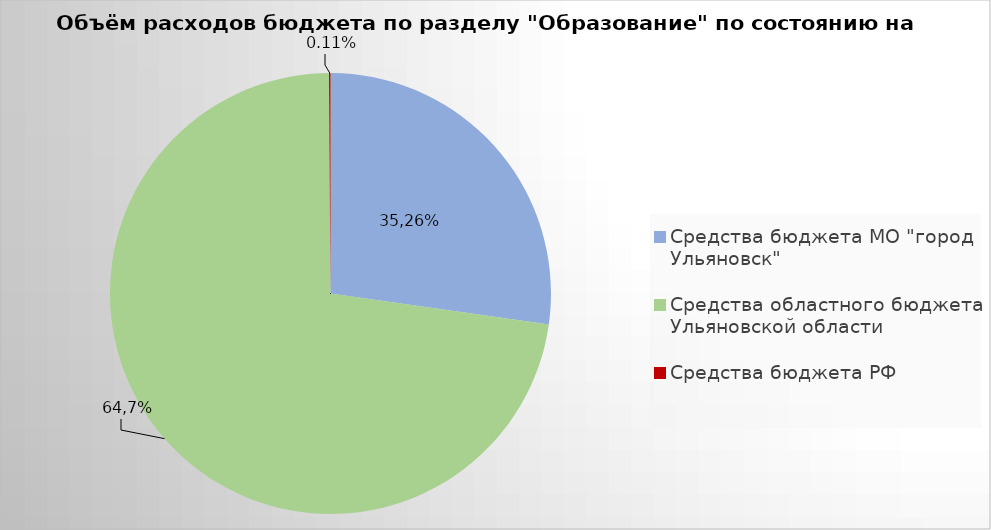
| Category | Series 0 |
|---|---|
| Средства бюджета МО "город Ульяновск" | 1600211.89 |
| Средства областного бюджета Ульяновской области | 4268687.49 |
| Средства бюджета РФ | 6333.1 |